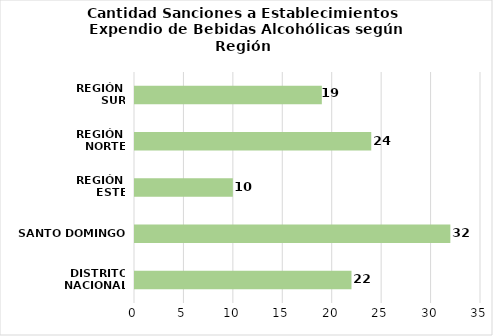
| Category | Series 0 |
|---|---|
| DISTRITO NACIONAL | 22 |
| SANTO DOMINGO | 32 |
| REGIÓN 
ESTE | 10 |
| REGIÓN 
NORTE | 24 |
| REGIÓN 
SUR | 19 |